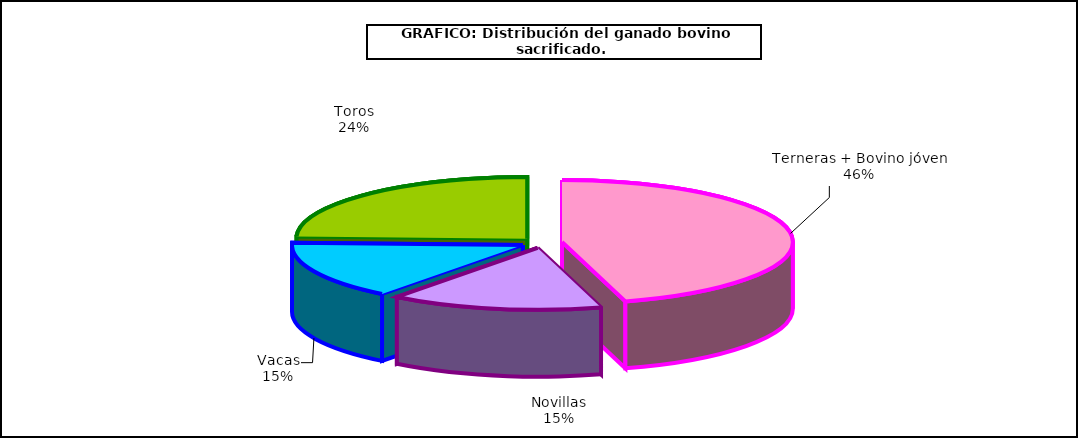
| Category | Series 0 |
|---|---|
| Terneras + Bovino jóven | 1089661 |
| Novillas | 355447 |
| Vacas | 361984 |
| Toros | 583911 |